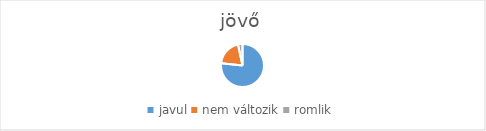
| Category | Series 0 |
|---|---|
| javul | 362 |
| nem változik | 94 |
| romlik | 16 |